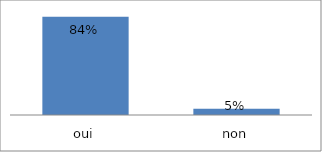
| Category | Series 0 |
|---|---|
| oui | 0.842 |
| non | 0.053 |